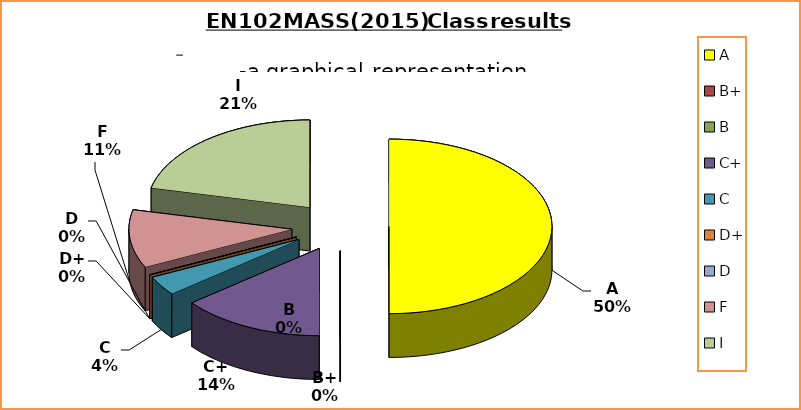
| Category | Series 0 |
|---|---|
| A | 14 |
| B+ | 0 |
| B | 0 |
| C+ | 4 |
| C | 1 |
| D+ | 0 |
| D | 0 |
| F | 3 |
| I | 6 |